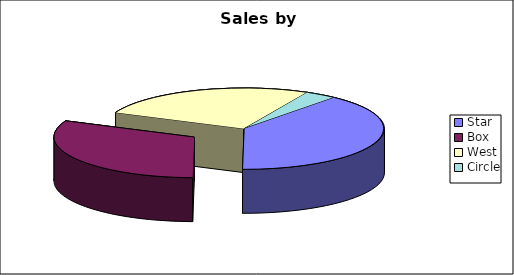
| Category | Series 0 |
|---|---|
| Star | 866201 |
| Box | 695060 |
| West | 574212 |
| Circle | 81330 |